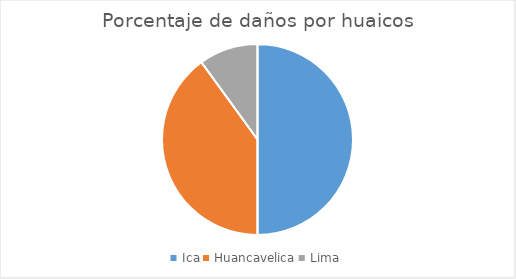
| Category | Series 0 |
|---|---|
| Ica | 0.5 |
| Huancavelica | 0.4 |
| Lima | 0.1 |